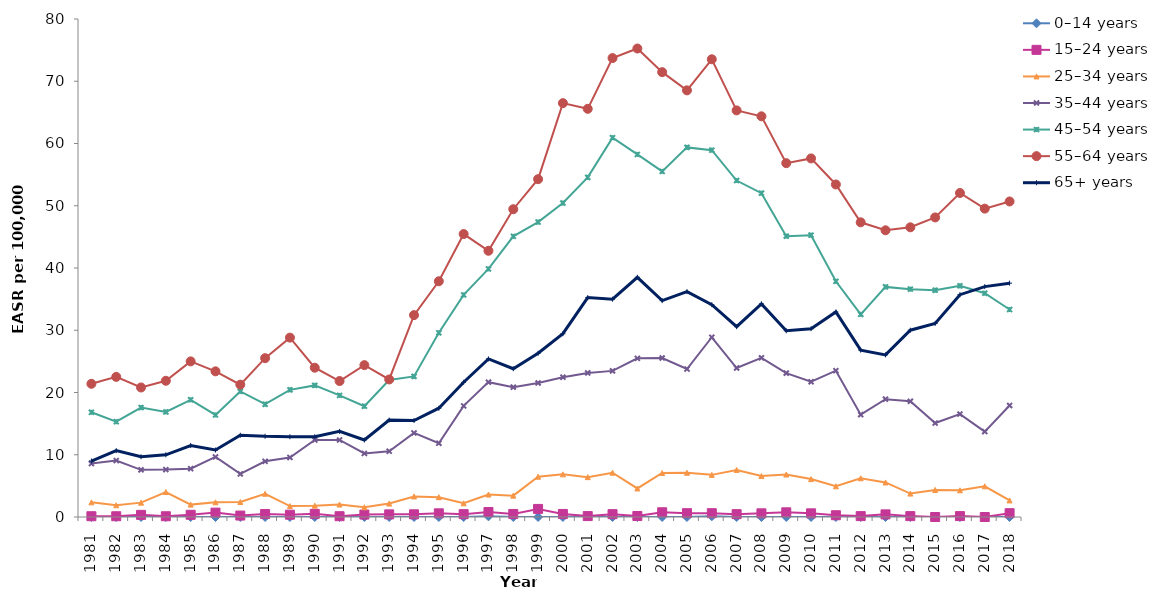
| Category | 0–14 years | 15–24 years | 25–34 years | 35–44 years | 45–54 years | 55–64 years | 65+ years |
|---|---|---|---|---|---|---|---|
| 1981.0 | 0 | 0.124 | 2.351 | 8.593 | 16.821 | 21.397 | 8.993 |
| 1982.0 | 0 | 0.121 | 1.888 | 9.071 | 15.31 | 22.508 | 10.661 |
| 1983.0 | 0 | 0.342 | 2.308 | 7.58 | 17.58 | 20.804 | 9.679 |
| 1984.0 | 0 | 0.121 | 4.01 | 7.611 | 16.88 | 21.882 | 9.99 |
| 1985.0 | 0 | 0.356 | 1.99 | 7.764 | 18.832 | 25 | 11.49 |
| 1986.0 | 0 | 0.704 | 2.357 | 9.649 | 16.396 | 23.401 | 10.757 |
| 1987.0 | 0 | 0.233 | 2.412 | 6.922 | 20.172 | 21.26 | 13.133 |
| 1988.0 | 0 | 0.483 | 3.731 | 8.943 | 18.116 | 25.514 | 12.965 |
| 1989.0 | 0 | 0.372 | 1.76 | 9.556 | 20.428 | 28.816 | 12.895 |
| 1990.0 | 0 | 0.504 | 1.815 | 12.365 | 21.141 | 23.982 | 12.892 |
| 1991.0 | 0 | 0.127 | 2.001 | 12.371 | 19.537 | 21.842 | 13.753 |
| 1992.0 | 0 | 0.392 | 1.561 | 10.212 | 17.797 | 24.397 | 12.379 |
| 1993.0 | 0 | 0.424 | 2.159 | 10.557 | 22.007 | 22.097 | 15.579 |
| 1994.0 | 0 | 0.434 | 3.301 | 13.503 | 22.582 | 32.431 | 15.502 |
| 1995.0 | 0 | 0.592 | 3.179 | 11.852 | 29.586 | 37.869 | 17.477 |
| 1996.0 | 0 | 0.46 | 2.202 | 17.851 | 35.675 | 45.454 | 21.644 |
| 1997.0 | 0.105 | 0.802 | 3.607 | 21.663 | 39.855 | 42.764 | 25.396 |
| 1998.0 | 0 | 0.488 | 3.432 | 20.86 | 45.085 | 49.445 | 23.822 |
| 1999.0 | 0 | 1.297 | 6.475 | 21.536 | 47.38 | 54.269 | 26.304 |
| 2000.0 | 0 | 0.488 | 6.851 | 22.454 | 50.433 | 66.484 | 29.443 |
| 2001.0 | 0.109 | 0.148 | 6.405 | 23.146 | 54.564 | 65.569 | 35.248 |
| 2002.0 | 0 | 0.457 | 7.118 | 23.473 | 60.94 | 73.722 | 34.989 |
| 2003.0 | 0 | 0.159 | 4.586 | 25.489 | 58.246 | 75.257 | 38.507 |
| 2004.0 | 0 | 0.759 | 7.066 | 25.544 | 55.52 | 71.462 | 34.756 |
| 2005.0 | 0 | 0.617 | 7.113 | 23.772 | 59.373 | 68.537 | 36.209 |
| 2006.0 | 0.113 | 0.613 | 6.769 | 28.875 | 58.934 | 73.528 | 34.106 |
| 2007.0 | 0 | 0.46 | 7.565 | 23.932 | 54.051 | 65.317 | 30.577 |
| 2008.0 | 0 | 0.59 | 6.581 | 25.567 | 52.022 | 64.37 | 34.239 |
| 2009.0 | 0 | 0.751 | 6.822 | 23.113 | 45.115 | 56.841 | 29.911 |
| 2010.0 | 0 | 0.589 | 6.091 | 21.722 | 45.276 | 57.602 | 30.248 |
| 2011.0 | 0 | 0.284 | 4.934 | 23.501 | 37.859 | 53.418 | 32.939 |
| 2012.0 | 0 | 0.141 | 6.22 | 16.442 | 32.554 | 47.341 | 26.81 |
| 2013.0 | 0 | 0.423 | 5.552 | 18.929 | 36.961 | 46.058 | 26.047 |
| 2014.0 | 0 | 0.141 | 3.761 | 18.585 | 36.604 | 46.538 | 30.006 |
| 2015.0 | 0 | 0 | 4.347 | 15.09 | 36.432 | 48.124 | 31.097 |
| 2016.0 | 0 | 0.143 | 4.285 | 16.534 | 37.129 | 52.05 | 35.715 |
| 2017.0 | 0 | 0 | 4.927 | 13.718 | 35.946 | 49.537 | 37.013 |
| 2018.0 | 0 | 0.613 | 2.662 | 17.917 | 33.33 | 50.688 | 37.56 |